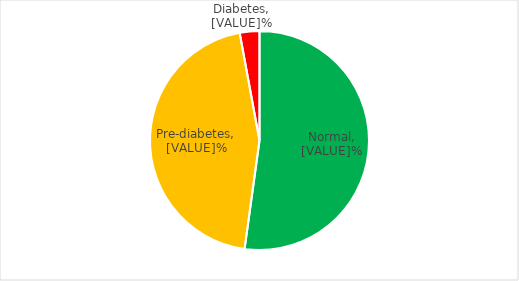
| Category | Series 0 |
|---|---|
| normal 4.0-5.6% | 52.174 |
| pre-d 5.7-6.4% | 44.928 |
| diab ≥6.5% | 2.899 |